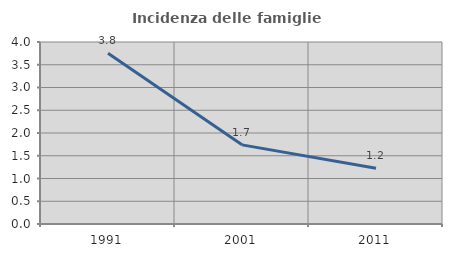
| Category | Incidenza delle famiglie numerose |
|---|---|
| 1991.0 | 3.753 |
| 2001.0 | 1.739 |
| 2011.0 | 1.227 |